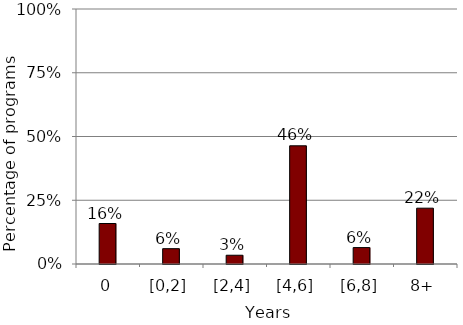
| Category | Series 0 |
|---|---|
| 0 | 0.159 |
| [0,2] | 0.06 |
| [2,4] | 0.034 |
| [4,6] | 0.464 |
| [6,8] | 0.064 |
| 8+ | 0.219 |